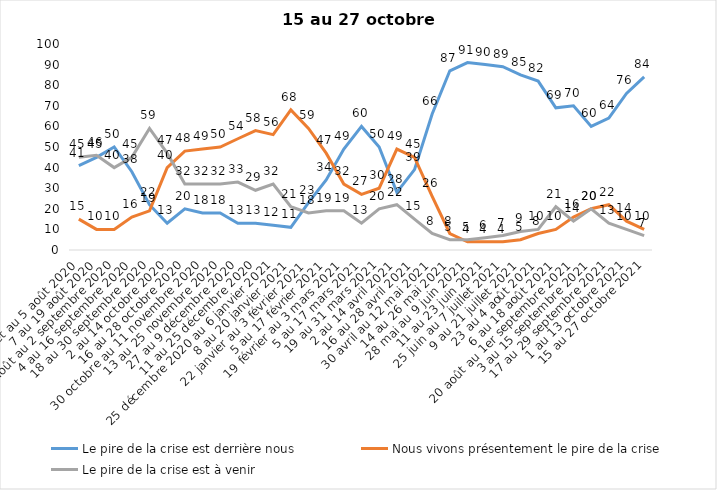
| Category | Le pire de la crise est derrière nous | Nous vivons présentement le pire de la crise | Le pire de la crise est à venir |
|---|---|---|---|
| 24 juillet au 5 août 2020 | 41 | 15 | 45 |
| 7 au 19 août 2020 | 45 | 10 | 46 |
| 21 août au 2 septembre 2020 | 50 | 10 | 40 |
| 4 au 16 septembre 2020 | 38 | 16 | 45 |
| 18 au 30 septembre 2020 | 22 | 19 | 59 |
| 2 au 14 octobre 2020 | 13 | 40 | 47 |
| 16 au 28 octobre 2020 | 20 | 48 | 32 |
| 30 octobre au 11 novembre 2020 | 18 | 49 | 32 |
| 13 au 25 novembre 2020 | 18 | 50 | 32 |
| 27 au 9 décembre 2020 | 13 | 54 | 33 |
| 11 au 25 décembre 2020 | 13 | 58 | 29 |
| 25 décembre 2020 au 6 janvier 2021 | 12 | 56 | 32 |
| 8 au 20 janvier 2021 | 11 | 68 | 21 |
| 22 janvier au 3 février 2021 | 23 | 59 | 18 |
| 5 au 17 février 2021 | 34 | 47 | 19 |
| 19 février au 3 mars 2021 | 49 | 32 | 19 |
| 5 au 17 mars 2021 | 60 | 27 | 13 |
| 19 au 31 mars 2021 | 50 | 30 | 20 |
| 2 au 14 avril 2021 | 28 | 49 | 22 |
| 16 au 28 avril 2021 | 39 | 45 | 15 |
| 30 avril au 12 mai 2021 | 66 | 26 | 8 |
| 14 au 26 mai 2021 | 87 | 8 | 5 |
| 28 mai au 9 juin 2021 | 91 | 4 | 5 |
| 11 au 23 juin 2021 | 90 | 4 | 6 |
| 25 juin au 7 juillet 2021 | 89 | 4 | 7 |
| 9 au 21 juillet 2021 | 85 | 5 | 9 |
| 23 au 4 août 2021 | 82 | 8 | 10 |
| 6 au 18 août 2021 | 69 | 10 | 21 |
| 20 août au 1er septembre 2021 | 70 | 16 | 14 |
| 3 au 15 septembre 2021 | 60 | 20 | 20 |
| 17 au 29 septembre 2021 | 64 | 22 | 13 |
| 1 au 13 octobre 2021 | 76 | 14 | 10 |
| 15 au 27 octobre 2021 | 84 | 10 | 7 |